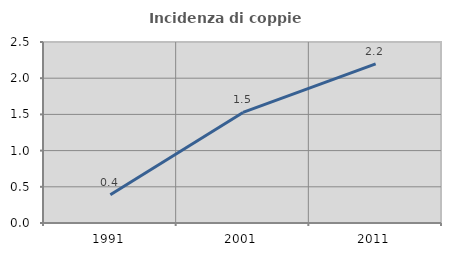
| Category | Incidenza di coppie miste |
|---|---|
| 1991.0 | 0.391 |
| 2001.0 | 1.527 |
| 2011.0 | 2.198 |